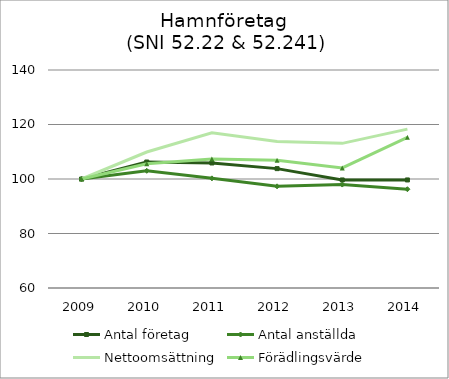
| Category | Antal företag | Antal anställda | Nettoomsättning | Förädlingsvärde |
|---|---|---|---|---|
| 2009.0 | 100 | 100 | 100 | 100 |
| 2010.0 | 106.228 | 103.02 | 109.904 | 105.565 |
| 2011.0 | 105.882 | 100.236 | 116.934 | 107.342 |
| 2012.0 | 103.806 | 97.308 | 113.73 | 106.85 |
| 2013.0 | 99.654 | 97.963 | 113.08 | 104.078 |
| 2014.0 | 99.654 | 96.253 | 118.299 | 115.297 |